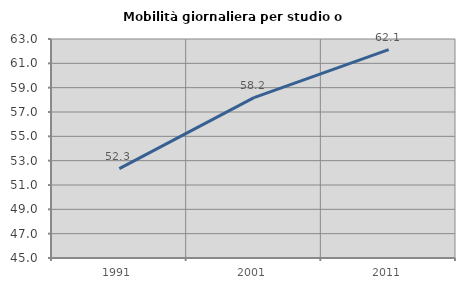
| Category | Mobilità giornaliera per studio o lavoro |
|---|---|
| 1991.0 | 52.34 |
| 2001.0 | 58.181 |
| 2011.0 | 62.131 |